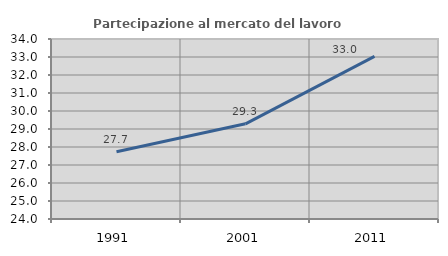
| Category | Partecipazione al mercato del lavoro  femminile |
|---|---|
| 1991.0 | 27.74 |
| 2001.0 | 29.288 |
| 2011.0 | 33.031 |